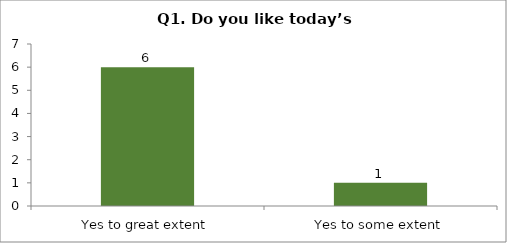
| Category | Q1. Do you like today’s session? |
|---|---|
| Yes to great extent | 6 |
| Yes to some extent | 1 |